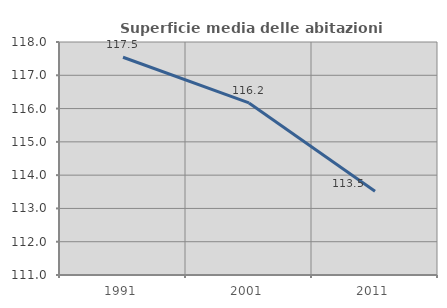
| Category | Superficie media delle abitazioni occupate |
|---|---|
| 1991.0 | 117.543 |
| 2001.0 | 116.17 |
| 2011.0 | 113.517 |